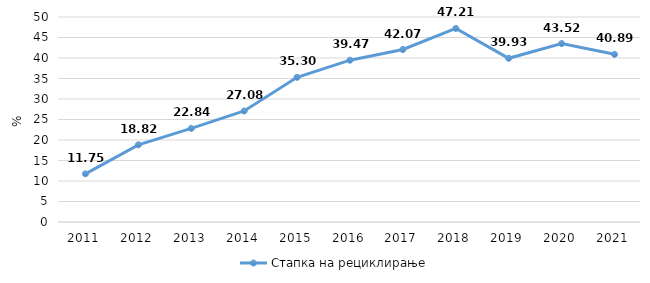
| Category | Стапка на рециклирање |
|---|---|
| 2011.0 | 11.751 |
| 2012.0 | 18.824 |
| 2013.0 | 22.839 |
| 2014.0 | 27.077 |
| 2015.0 | 35.295 |
| 2016.0 | 39.467 |
| 2017.0 | 42.073 |
| 2018.0 | 47.212 |
| 2019.0 | 39.933 |
| 2020.0 | 43.519 |
| 2021.0 | 40.893 |